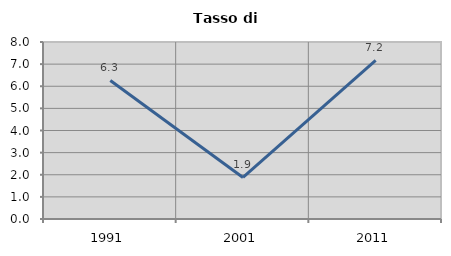
| Category | Tasso di disoccupazione   |
|---|---|
| 1991.0 | 6.262 |
| 2001.0 | 1.877 |
| 2011.0 | 7.164 |